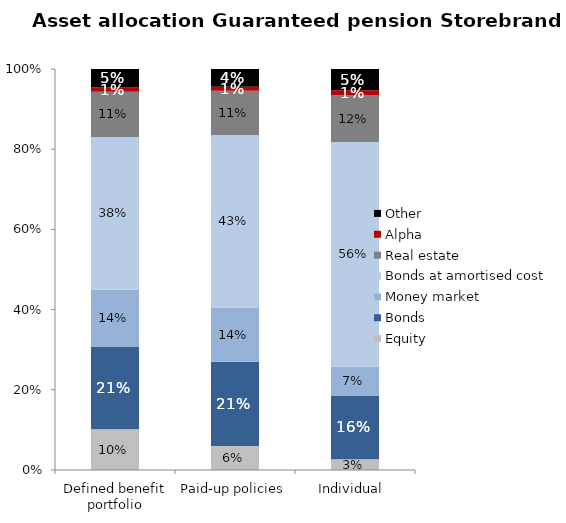
| Category | Equity | Bonds | Money market | Bonds at amortised cost | Real estate | Alpha | Other |
|---|---|---|---|---|---|---|---|
| Defined benefit portfolio | 0.102 | 0.206 | 0.142 | 0.381 | 0.113 | 0.011 | 0.046 |
| Paid-up policies | 0.06 | 0.21 | 0.135 | 0.431 | 0.111 | 0.01 | 0.044 |
| Individual  | 0.027 | 0.159 | 0.072 | 0.56 | 0.117 | 0.012 | 0.053 |